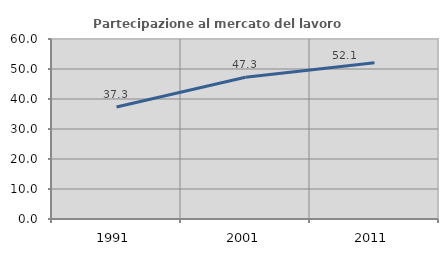
| Category | Partecipazione al mercato del lavoro  femminile |
|---|---|
| 1991.0 | 37.333 |
| 2001.0 | 47.269 |
| 2011.0 | 52.094 |